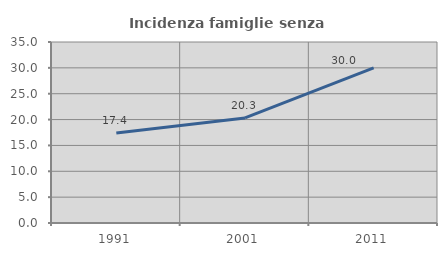
| Category | Incidenza famiglie senza nuclei |
|---|---|
| 1991.0 | 17.406 |
| 2001.0 | 20.32 |
| 2011.0 | 29.978 |